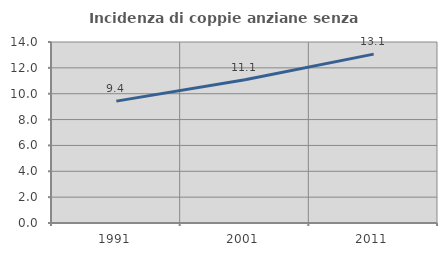
| Category | Incidenza di coppie anziane senza figli  |
|---|---|
| 1991.0 | 9.428 |
| 2001.0 | 11.075 |
| 2011.0 | 13.063 |